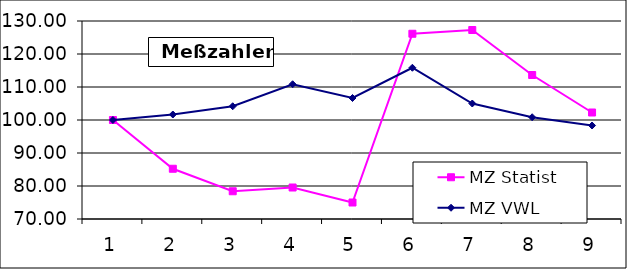
| Category | MZ Statist | MZ VWL |
|---|---|---|
| 0 | 100 | 100 |
| 1 | 85.227 | 101.667 |
| 2 | 78.409 | 104.167 |
| 3 | 79.545 | 110.833 |
| 4 | 75 | 106.667 |
| 5 | 126.136 | 115.833 |
| 6 | 127.273 | 105 |
| 7 | 113.636 | 100.833 |
| 8 | 102.273 | 98.333 |